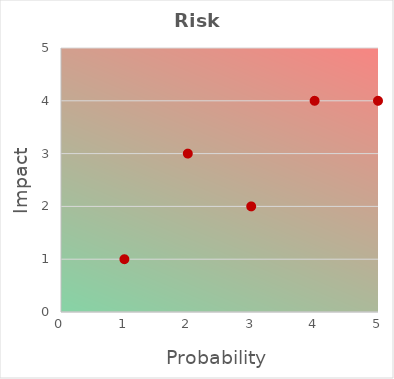
| Category | Probability |
|---|---|
| 1.0 | 1 |
| 2.0 | 3 |
| 3.0 | 2 |
| 4.0 | 4 |
| 5.0 | 4 |